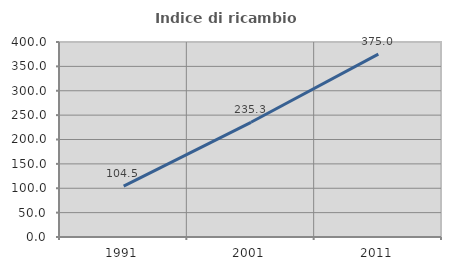
| Category | Indice di ricambio occupazionale  |
|---|---|
| 1991.0 | 104.545 |
| 2001.0 | 235.294 |
| 2011.0 | 375 |